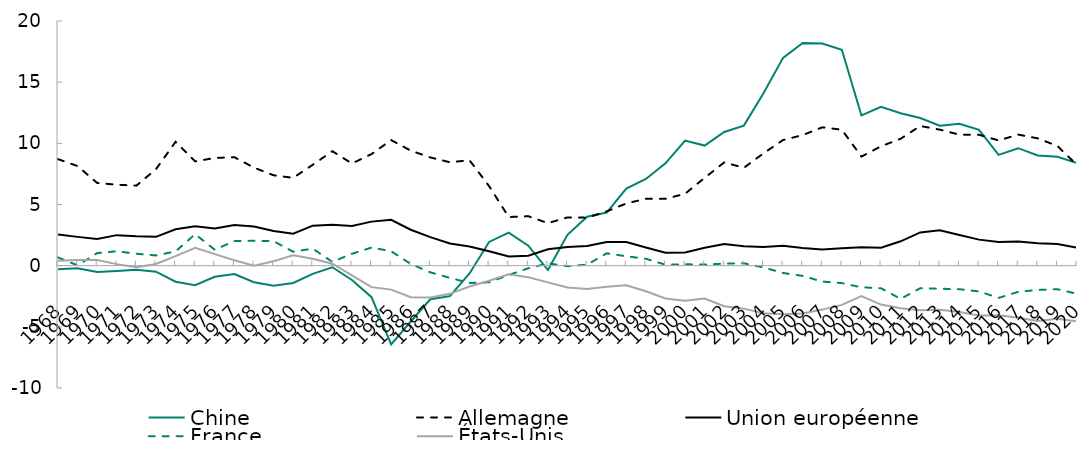
| Category | Chine | Allemagne | Union européenne | France | États-Unis |
|---|---|---|---|---|---|
| 1968 | -0.283 | 8.709 | 2.54 | 0.672 | 0.409 |
| 1969 | -0.214 | 8.141 | 2.353 | 0.026 | 0.47 |
| 1970 | -0.517 | 6.761 | 2.176 | 1.029 | 0.455 |
| 1971 | -0.438 | 6.62 | 2.496 | 1.177 | 0.127 |
| 1972 | -0.334 | 6.54 | 2.404 | 0.977 | -0.134 |
| 1973 | -0.489 | 7.886 | 2.355 | 0.836 | 0.136 |
| 1974 | -1.31 | 10.125 | 2.971 | 1.167 | 0.778 |
| 1975 | -1.592 | 8.521 | 3.212 | 2.574 | 1.452 |
| 1976 | -0.906 | 8.807 | 3.039 | 1.304 | 0.941 |
| 1977 | -0.686 | 8.865 | 3.327 | 2.008 | 0.446 |
| 1978 | -1.356 | 8.015 | 3.203 | 2.036 | -0.011 |
| 1979 | -1.636 | 7.389 | 2.842 | 1.999 | 0.365 |
| 1980 | -1.417 | 7.179 | 2.612 | 1.14 | 0.852 |
| 1981 | -0.668 | 8.242 | 3.267 | 1.396 | 0.572 |
| 1982 | -0.128 | 9.359 | 3.339 | 0.307 | 0.159 |
| 1983 | -1.169 | 8.35 | 3.246 | 0.976 | -0.785 |
| 1984 | -2.572 | 9.122 | 3.6 | 1.479 | -1.755 |
| 1985 | -6.441 | 10.266 | 3.748 | 1.181 | -1.958 |
| 1986 | -4.564 | 9.403 | 2.935 | 0.138 | -2.572 |
| 1987 | -2.745 | 8.848 | 2.33 | -0.547 | -2.611 |
| 1988 | -2.494 | 8.454 | 1.808 | -1 | -2.304 |
| 1989 | -0.639 | 8.616 | 1.56 | -1.42 | -1.7 |
| 1990 | 1.941 | 6.501 | 1.184 | -1.356 | -1.235 |
| 1991 | 2.702 | 3.976 | 0.744 | -0.764 | -0.706 |
| 1992 | 1.633 | 4.041 | 0.813 | -0.213 | -0.951 |
| 1993 | -0.357 | 3.477 | 1.345 | 0.192 | -1.366 |
| 1994 | 2.521 | 3.944 | 1.528 | -0.046 | -1.777 |
| 1995 | 4.004 | 3.924 | 1.6 | 0.081 | -1.913 |
| 1996 | 4.345 | 4.436 | 1.935 | 1.007 | -1.719 |
| 1997 | 6.299 | 5.085 | 1.928 | 0.769 | -1.6 |
| 1998 | 7.086 | 5.47 | 1.482 | 0.565 | -2.087 |
| 1999 | 8.365 | 5.462 | 1.049 | 0.076 | -2.677 |
| 2000 | 10.219 | 5.878 | 1.075 | 0.113 | -2.875 |
| 2001 | 9.818 | 7.181 | 1.466 | 0.088 | -2.683 |
| 2002 | 10.927 | 8.444 | 1.776 | 0.166 | -3.315 |
| 2003 | 11.451 | 7.999 | 1.583 | 0.194 | -3.513 |
| 2004 | 14.099 | 9.184 | 1.526 | -0.142 | -3.889 |
| 2005 | 16.986 | 10.271 | 1.626 | -0.595 | -3.968 |
| 2006 | 18.205 | 10.674 | 1.448 | -0.836 | -3.911 |
| 2007 | 18.16 | 11.308 | 1.313 | -1.298 | -3.592 |
| 2008 | 17.648 | 11.114 | 1.429 | -1.428 | -3.205 |
| 2009 | 12.279 | 8.917 | 1.498 | -1.769 | -2.487 |
| 2010 | 12.981 | 9.762 | 1.471 | -1.844 | -3.183 |
| 2011 | 12.455 | 10.372 | 1.992 | -2.715 | -3.485 |
| 2012 | 12.073 | 11.42 | 2.717 | -1.842 | -3.641 |
| 2013 | 11.437 | 11.116 | 2.897 | -1.887 | -3.61 |
| 2014 | 11.598 | 10.708 | 2.507 | -1.924 | -3.783 |
| 2015 | 11.103 | 10.699 | 2.129 | -2.107 | -4.068 |
| 2016 | 9.052 | 10.237 | 1.932 | -2.634 | -4.051 |
| 2017 | 9.603 | 10.715 | 1.978 | -2.141 | -4.255 |
| 2018 | 9.01 | 10.406 | 1.824 | -1.985 | -4.516 |
| 2019 | 8.895 | 9.781 | 1.762 | -1.925 | -4.348 |
| 2020 | 8.387 | 8.233 | 1.461 | -2.3 | -4.55 |